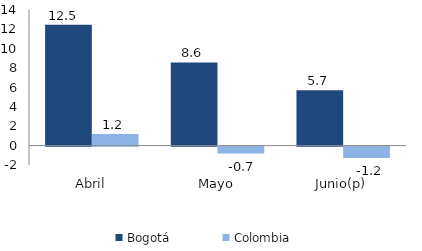
| Category | Bogotá | Colombia |
|---|---|---|
| Abril | 12.48 | 1.202 |
| Mayo | 8.589 | -0.719 |
| Junio(p) | 5.724 | -1.162 |